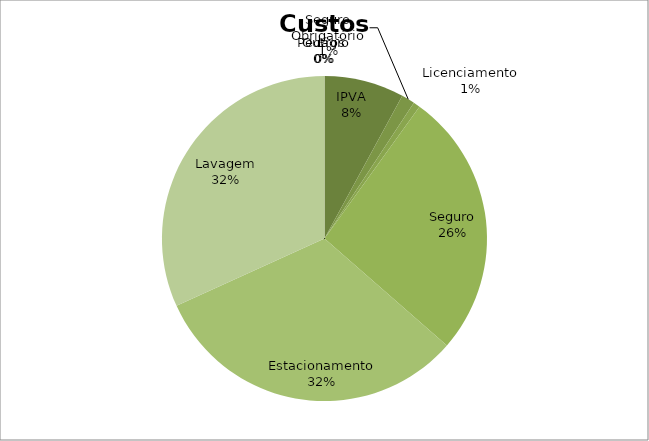
| Category | Series 0 |
|---|---|
| IPVA | 50 |
| Seguro Obrigatório | 8.333 |
| Licenciamento | 4.167 |
| Seguro | 166.667 |
| Estacionamento | 200 |
| Lavagem | 200 |
| Pedágio | 0 |
| Outros | 0 |